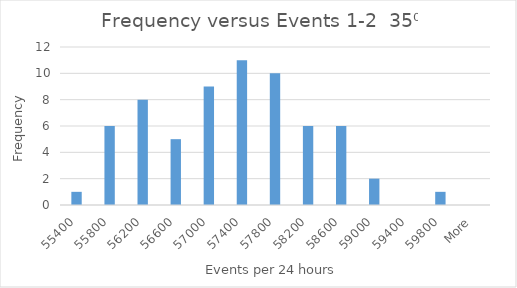
| Category | Frequency |
|---|---|
| 55400 | 1 |
| 55800 | 6 |
| 56200 | 8 |
| 56600 | 5 |
| 57000 | 9 |
| 57400 | 11 |
| 57800 | 10 |
| 58200 | 6 |
| 58600 | 6 |
| 59000 | 2 |
| 59400 | 0 |
| 59800 | 1 |
| More | 0 |